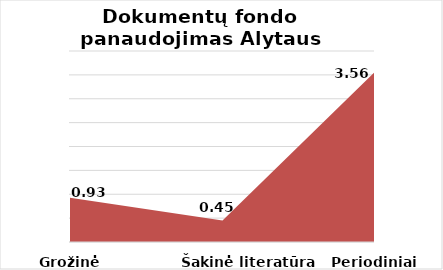
| Category | Series 0 |
|---|---|
| Grožinė literatūra | 0.929 |
| Šakinė literatūra | 0.453 |
| Periodiniai leidiniai | 3.564 |